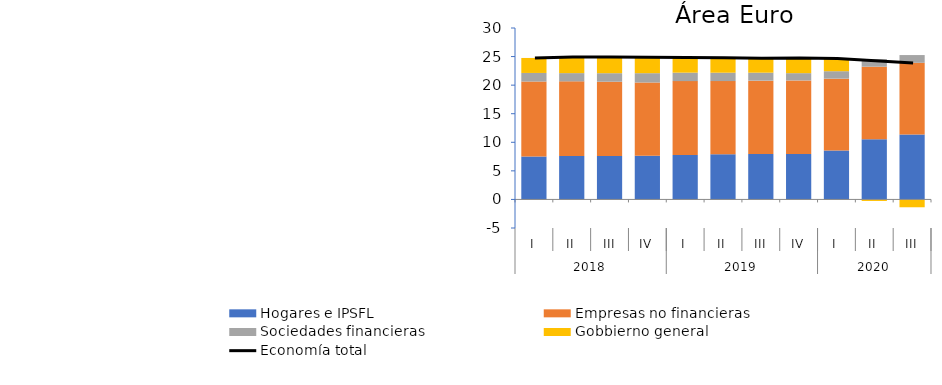
| Category | Hogares e IPSFL | Empresas no financieras | Sociedades financieras | Gobbierno general |
|---|---|---|---|---|
| 0 | 7.524 | 13.109 | 1.5 | 2.625 |
| 1 | 7.592 | 13.071 | 1.442 | 2.814 |
| 2 | 7.598 | 13 | 1.492 | 2.838 |
| 3 | 7.635 | 12.828 | 1.631 | 2.769 |
| 4 | 7.756 | 12.947 | 1.485 | 2.666 |
| 5 | 7.902 | 12.809 | 1.467 | 2.597 |
| 6 | 7.953 | 12.832 | 1.398 | 2.541 |
| 7 | 7.941 | 12.886 | 1.27 | 2.67 |
| 8 | 8.584 | 12.549 | 1.306 | 2.216 |
| 9 | 10.515 | 12.711 | 1.326 | -0.266 |
| 10 | 11.359 | 12.554 | 1.351 | -1.372 |